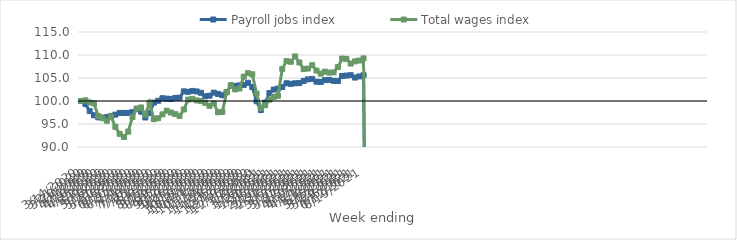
| Category | Payroll jobs index | Total wages index |
|---|---|---|
| 14/03/2020 | 100 | 100 |
| 21/03/2020 | 99.358 | 100.143 |
| 28/03/2020 | 97.81 | 99.683 |
| 04/04/2020 | 96.887 | 99.49 |
| 11/04/2020 | 96.443 | 96.704 |
| 18/04/2020 | 96.404 | 96.266 |
| 25/04/2020 | 96.499 | 95.707 |
| 02/05/2020 | 96.75 | 96.612 |
| 09/05/2020 | 97.031 | 94.381 |
| 16/05/2020 | 97.409 | 92.85 |
| 23/05/2020 | 97.396 | 92.176 |
| 30/05/2020 | 97.422 | 93.341 |
| 06/06/2020 | 97.575 | 96.528 |
| 13/06/2020 | 98.246 | 98.355 |
| 20/06/2020 | 97.676 | 98.593 |
| 27/06/2020 | 96.414 | 97.048 |
| 04/07/2020 | 97.371 | 99.629 |
| 11/07/2020 | 99.65 | 96.058 |
| 18/07/2020 | 100.047 | 96.256 |
| 25/07/2020 | 100.607 | 97.094 |
| 01/08/2020 | 100.521 | 97.886 |
| 08/08/2020 | 100.444 | 97.496 |
| 15/08/2020 | 100.667 | 97.157 |
| 22/08/2020 | 100.711 | 96.758 |
| 29/08/2020 | 102.097 | 98.155 |
| 05/09/2020 | 102.003 | 100.306 |
| 12/09/2020 | 102.194 | 100.466 |
| 19/09/2020 | 102.073 | 100.128 |
| 26/09/2020 | 101.784 | 100.016 |
| 03/10/2020 | 101.034 | 99.597 |
| 10/10/2020 | 101.16 | 98.95 |
| 17/10/2020 | 101.823 | 99.487 |
| 24/10/2020 | 101.538 | 97.547 |
| 31/10/2020 | 101.26 | 97.621 |
| 07/11/2020 | 101.956 | 101.87 |
| 14/11/2020 | 103.346 | 103.452 |
| 21/11/2020 | 103.275 | 102.522 |
| 28/11/2020 | 103.387 | 102.718 |
| 05/12/2020 | 103.498 | 105.292 |
| 12/12/2020 | 103.961 | 106.044 |
| 19/12/2020 | 103.037 | 105.81 |
| 26/12/2020 | 99.952 | 101.61 |
| 02/01/2021 | 98.035 | 98.415 |
| 09/01/2021 | 99.647 | 99.073 |
| 16/01/2021 | 101.726 | 100.288 |
| 23/01/2021 | 102.483 | 100.887 |
| 30/01/2021 | 102.684 | 101.133 |
| 06/02/2021 | 103.046 | 106.962 |
| 13/02/2021 | 103.859 | 108.672 |
| 20/02/2021 | 103.735 | 108.532 |
| 27/02/2021 | 103.846 | 109.685 |
| 06/03/2021 | 103.897 | 108.375 |
| 13/03/2021 | 104.352 | 106.935 |
| 20/03/2021 | 104.7 | 107.057 |
| 27/03/2021 | 104.808 | 107.78 |
| 03/04/2021 | 104.194 | 106.626 |
| 10/04/2021 | 104.136 | 105.955 |
| 17/04/2021 | 104.53 | 106.383 |
| 24/04/2021 | 104.597 | 106.179 |
| 01/05/2021 | 104.385 | 106.214 |
| 08/05/2021 | 104.337 | 107.371 |
| 15/05/2021 | 105.435 | 109.229 |
| 22/05/2021 | 105.53 | 109.15 |
| 29/05/2021 | 105.612 | 108.136 |
| 05/06/2021 | 105.092 | 108.615 |
| 12/06/2021 | 105.338 | 108.797 |
| 19/06/2021 | 105.611 | 109.264 |